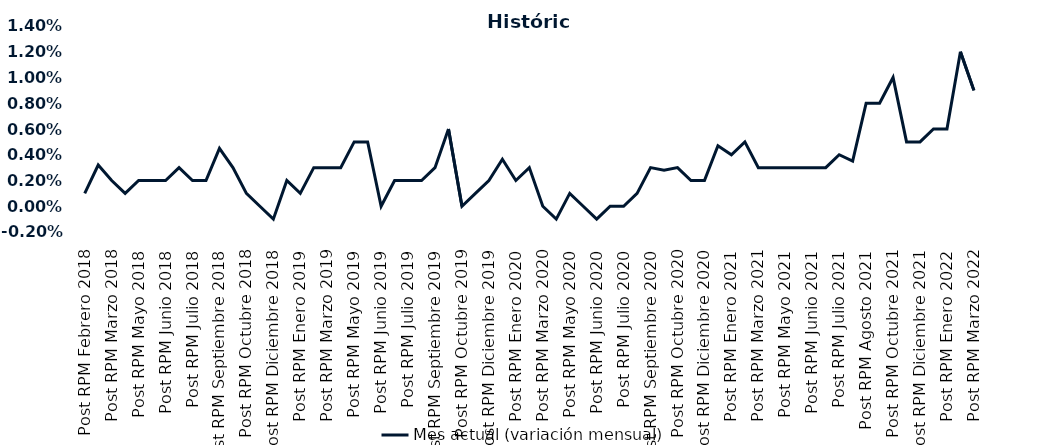
| Category | Mes actual (variación mensual)  |
|---|---|
| Post RPM Febrero 2018 | 0.001 |
| Pre RPM Marzo 2018 | 0.003 |
| Post RPM Marzo 2018 | 0.002 |
| Pre RPM Mayo 2018 | 0.001 |
| Post RPM Mayo 2018 | 0.002 |
| Pre RPM Junio 2018 | 0.002 |
| Post RPM Junio 2018 | 0.002 |
| Pre RPM Julio 2018 | 0.003 |
| Post RPM Julio 2018 | 0.002 |
| Pre RPM Septiembre 2018 | 0.002 |
| Post RPM Septiembre 2018 | 0.004 |
| Pre RPM Octubre 2018 | 0.003 |
| Post RPM Octubre 2018 | 0.001 |
| Pre RPM Diciembre 2018 | 0 |
| Post RPM Diciembre 2018 | -0.001 |
| Pre RPM Enero 2019 | 0.002 |
| Post RPM Enero 2019 | 0.001 |
| Pre RPM Marzo 2019 | 0.003 |
| Post RPM Marzo 2019 | 0.003 |
| Pre RPM Mayo 2019 | 0.003 |
| Post RPM Mayo 2019 | 0.005 |
| Pre RPM Junio 2019 | 0.005 |
| Post RPM Junio 2019 | 0 |
| Pre RPM Julio 2019 | 0.002 |
| Post RPM Julio 2019 | 0.002 |
| Pre RPM Septiembre 2019 | 0.002 |
| Post RPM Septiembre 2019 | 0.003 |
| Pre RPM Octubre 2019 | 0.006 |
| Post RPM Octubre 2019 | 0 |
| Pre RPM Diciembre 2019 | 0.001 |
| Post RPM Diciembre 2019 | 0.002 |
| Pre RPM Enero 2020 | 0.004 |
| Post RPM Enero 2020 | 0.002 |
| Pre RPM Marzo 2020 | 0.003 |
| Post RPM Marzo 2020 | 0 |
| Pre RPM Mayo 2020 | -0.001 |
| Post RPM Mayo 2020 | 0.001 |
| Pre RPM Junio 2020 | 0 |
| Post RPM Junio 2020 | -0.001 |
| Pre RPM Julio 2020 | 0 |
| Post RPM Julio 2020 | 0 |
| Pre RPM Septiembre 2020 | 0.001 |
| Post RPM Septiembre 2020 | 0.003 |
| Pre RPM Octubre 2020 | 0.003 |
| Post RPM Octubre 2020 | 0.003 |
| Pre RPM Diciembre 2020 | 0.002 |
| Post RPM Diciembre 2020 | 0.002 |
| Pre RPM Enero 2021 | 0.005 |
| Post RPM Enero 2021 | 0.004 |
| Pre RPM Marzo 2021 | 0.005 |
| Post RPM Marzo 2021 | 0.003 |
| Pre RPM Mayo 2021 | 0.003 |
| Post RPM Mayo 2021 | 0.003 |
| Pre RPM Junio 2021 | 0.003 |
| Post RPM Junio 2021 | 0.003 |
| Pre RPM Julio 2021 | 0.003 |
| Post RPM Julio 2021 | 0.004 |
| Pre RPM Agosto 2021 | 0.004 |
| Post RPM Agosto 2021 | 0.008 |
| Pre RPM Octubre 2021 | 0.008 |
| Post RPM Octubre 2021 | 0.01 |
| Pre RPM Diciembre 2021 | 0.005 |
| Post RPM Diciembre 2021 | 0.005 |
| Pre RPM Enero 2022 | 0.006 |
| Post RPM Enero 2022 | 0.006 |
| Pre RPM Marzo 2022 | 0.012 |
| Post RPM Marzo 2022 | 0.009 |